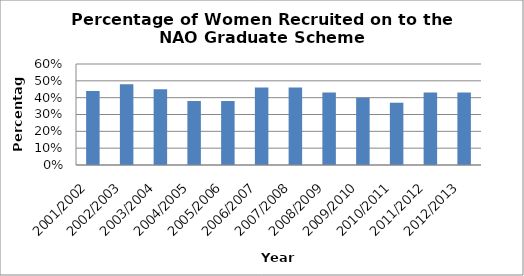
| Category | Percentage |
|---|---|
| 2001/2002 | 0.44 |
| 2002/2003 | 0.48 |
| 2003/2004 | 0.45 |
| 2004/2005 | 0.38 |
| 2005/2006 | 0.38 |
| 2006/2007 | 0.46 |
| 2007/2008 | 0.46 |
| 2008/2009 | 0.43 |
| 2009/2010 | 0.4 |
| 2010/2011 | 0.37 |
| 2011/2012 | 0.43 |
| 2012/2013 | 0.43 |